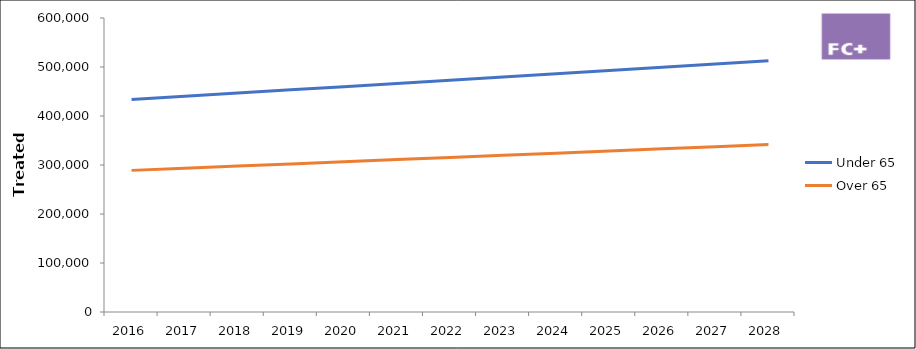
| Category | Under 65 | Over 65 |
|---|---|---|
| 2016.0 | 433542.579 | 289028.386 |
| 2017.0 | 440142.068 | 293428.045 |
| 2018.0 | 446741.557 | 297827.704 |
| 2019.0 | 453341.045 | 302227.364 |
| 2020.0 | 459940.534 | 306627.023 |
| 2021.0 | 466540.023 | 311026.682 |
| 2022.0 | 473139.512 | 315426.341 |
| 2023.0 | 479739.001 | 319826 |
| 2024.0 | 486338.489 | 324225.66 |
| 2025.0 | 492937.978 | 328625.319 |
| 2026.0 | 499537.467 | 333024.978 |
| 2027.0 | 506136.956 | 337424.637 |
| 2028.0 | 512736.444 | 341824.296 |